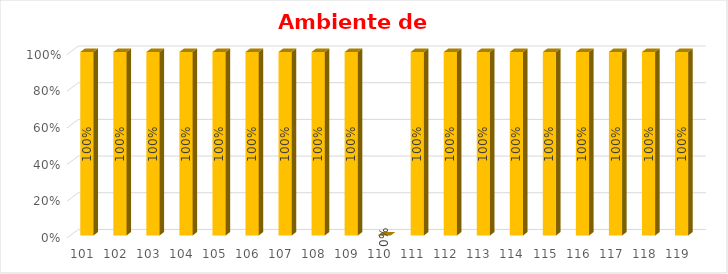
| Category | % Avance |
|---|---|
| 101.0 | 1 |
| 102.0 | 1 |
| 103.0 | 1 |
| 104.0 | 1 |
| 105.0 | 1 |
| 106.0 | 1 |
| 107.0 | 1 |
| 108.0 | 1 |
| 109.0 | 1 |
| 110.0 | 0 |
| 111.0 | 1 |
| 112.0 | 1 |
| 113.0 | 1 |
| 114.0 | 1 |
| 115.0 | 1 |
| 116.0 | 1 |
| 117.0 | 1 |
| 118.0 | 1 |
| 119.0 | 1 |